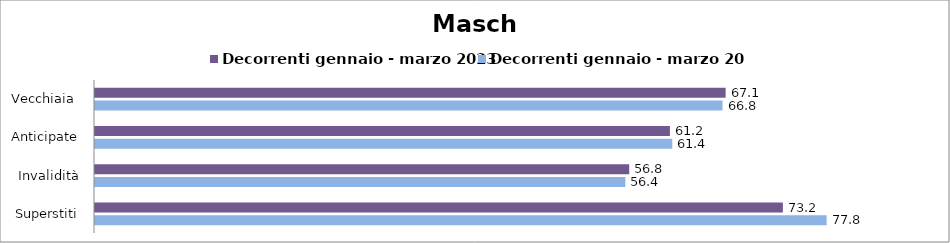
| Category | Decorrenti gennaio - marzo 2023 | Decorrenti gennaio - marzo 2024 |
|---|---|---|
| Vecchiaia  | 67.09 | 66.76 |
| Anticipate | 61.16 | 61.41 |
| Invalidità | 56.83 | 56.42 |
| Superstiti | 73.18 | 77.83 |